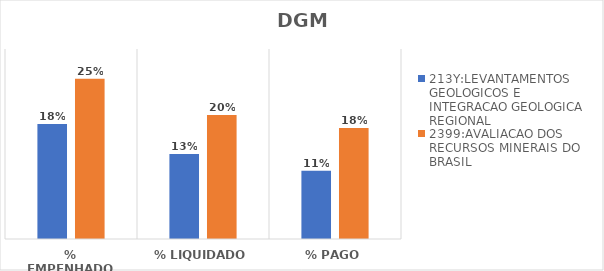
| Category | 213Y:LEVANTAMENTOS GEOLOGICOS E INTEGRACAO GEOLOGICA REGIONAL | 2399:AVALIACAO DOS RECURSOS MINERAIS DO BRASIL |
|---|---|---|
| % EMPENHADO | 0.182 | 0.253 |
| % LIQUIDADO | 0.134 | 0.196 |
| % PAGO | 0.108 | 0.175 |